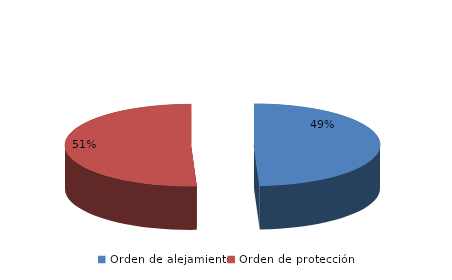
| Category | Series 0 |
|---|---|
| Orden de alejamiento | 34 |
| Orden de protección | 35 |